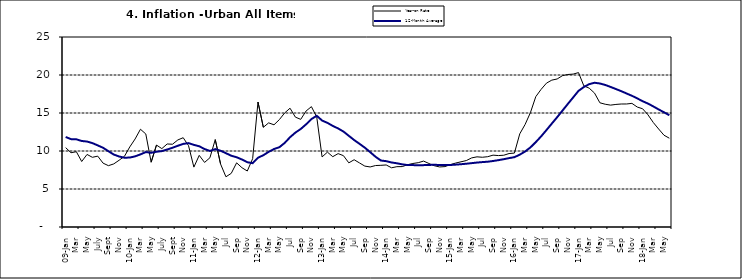
| Category | Year-on Rate | 12-Month Average |
|---|---|---|
| 09-Jan | 10.439 | 11.844 |
| Feb | 9.772 | 11.562 |
| Mar | 9.907 | 11.538 |
| Apr | 8.618 | 11.319 |
| May | 9.547 | 11.246 |
| June | 9.17 | 11.039 |
| July | 9.325 | 10.738 |
| Aug | 8.401 | 10.424 |
| Sept | 8.07 | 9.973 |
| Oct | 8.3 | 9.535 |
| Nov | 8.781 | 9.278 |
| Dec | 9.298 | 9.117 |
| 10-Jan | 10.534 | 9.136 |
| Feb | 11.584 | 9.297 |
| Mar | 12.864 | 9.555 |
| Apr | 12.24 | 9.859 |
| May | 8.524 | 9.769 |
| June | 10.781 | 9.904 |
| July | 10.313 | 9.987 |
| Aug | 10.924 | 10.197 |
| Sept | 10.891 | 10.43 |
| Oct | 11.457 | 10.689 |
| Nov | 11.748 | 10.932 |
| Dec | 10.699 | 11.042 |
| 11-Jan | 7.878 | 10.806 |
| Feb | 9.426 | 10.623 |
| Mar | 8.498 | 10.26 |
| Apr | 9.11 | 10.005 |
| May | 11.5 | 10.249 |
| Jun | 8.278 | 10.034 |
| Jul | 6.608 | 9.711 |
| Aug | 7.061 | 9.38 |
| Sep | 8.443 | 9.178 |
| Oct | 7.802 | 8.88 |
| Nov | 7.365 | 8.525 |
| Dec | 8.993 | 8.395 |
| 12-Jan | 16.445 | 9.119 |
| Feb | 13.123 | 9.443 |
| Mar | 13.701 | 9.889 |
| Apr | 13.447 | 10.259 |
| May | 14.127 | 10.496 |
| Jun | 15.012 | 11.062 |
| Jul | 15.63 | 11.81 |
| Aug | 14.456 | 12.422 |
| Sep | 14.162 | 12.893 |
| Oct | 15.26 | 13.506 |
| Nov | 15.836 | 14.199 |
| Dec | 14.459 | 14.637 |
| 13-Jan | 9.22 | 14.006 |
| Feb | 9.85 | 13.703 |
| Mar | 9.253 | 13.302 |
| Apr | 9.657 | 12.966 |
| May | 9.385 | 12.557 |
| Jun | 8.441 | 11.999 |
| Jul | 8.849 | 11.443 |
| Aug | 8.431 | 10.946 |
| Sep | 8.013 | 10.44 |
| Oct | 7.9 | 9.849 |
| Nov | 8.086 | 9.245 |
| Dec | 8.117 | 8.75 |
| 14-Jan | 8.164 | 8.662 |
| Feb | 7.791 | 8.493 |
| Mar | 7.937 | 8.384 |
| Apr | 7.947 | 8.246 |
| May | 8.195 | 8.151 |
| Jun | 8.358 | 8.146 |
| Jul | 8.464 | 8.118 |
| Aug | 8.673 | 8.141 |
| Sep | 8.357 | 8.17 |
| Oct | 8.064 | 8.182 |
| Nov | 7.902 | 8.165 |
| Dec | 7.948 | 8.151 |
| 15-Jan | 8.211 | 8.155 |
| Feb | 8.412 | 8.206 |
| Mar | 8.579 | 8.26 |
| Apr | 8.742 | 8.326 |
| May | 9.092 | 8.403 |
| Jun | 9.232 | 8.478 |
| Jul | 9.177 | 8.54 |
| Aug | 9.25 | 8.591 |
| Sep | 9.455 | 8.684 |
| Oct | 9.398 | 8.795 |
| Nov | 9.442 | 8.922 |
| Dec | 9.665 | 9.064 |
| 16-Jan | 9.728 | 9.19 |
| Feb | 12.254 | 9.516 |
| Mar | 13.485 | 9.935 |
| Apr | 15.052 | 10.474 |
| May | 17.148 | 11.165 |
| Jun | 18.111 | 11.925 |
| Jul | 18.927 | 12.754 |
| Aug | 19.325 | 13.605 |
| Sep | 19.476 | 14.444 |
| Oct | 19.914 | 15.318 |
| Nov | 20.067 | 16.193 |
| Dec | 20.118 | 17.05 |
| 17-Jan | 20.315 | 17.914 |
| Feb | 18.569 | 18.418 |
| Mar | 18.27 | 18.794 |
| Apr | 17.621 | 18.982 |
| May | 16.343 | 18.883 |
| Jun | 16.153 | 18.692 |
| Jul | 16.038 | 18.43 |
| Aug | 16.128 | 18.151 |
| Sep | 16.183 | 17.872 |
| Oct | 16.187 | 17.567 |
| Nov | 16.267 | 17.264 |
| Dec | 15.785 | 16.921 |
| 18-Jan | 15.559 | 16.55 |
| Feb | 14.763 | 16.241 |
| Mar | 13.748 | 15.866 |
| Apr | 12.893 | 15.468 |
| May | 12.077 | 15.096 |
| June | 11.683 | 14.706 |